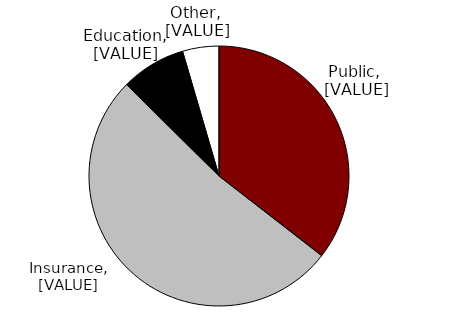
| Category | Series 0 |
|---|---|
| Public | 0.355 |
| Insurance | 0.519 |
| Education | 0.081 |
| Other | 0.045 |